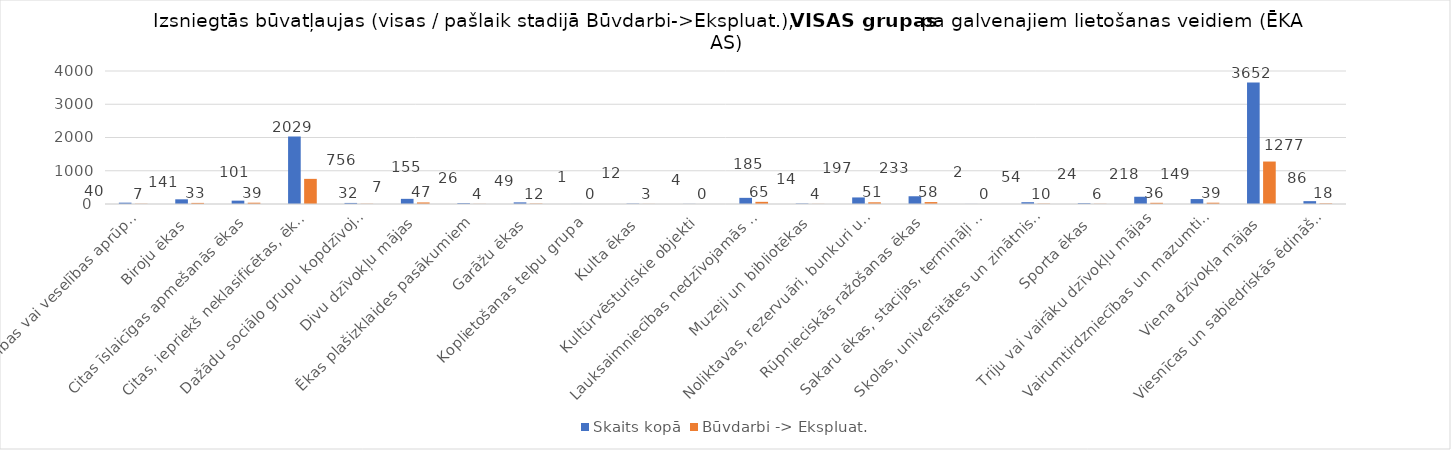
| Category | Skaits kopā | Būvdarbi -> Ekspluat. |
|---|---|---|
| Ārstniecības vai veselības aprūpes iestāžu ēkas | 40 | 7 |
| Biroju ēkas | 141 | 33 |
| Citas īslaicīgas apmešanās ēkas | 101 | 39 |
| Citas, iepriekš neklasificētas, ēkas | 2029 | 756 |
| Dažādu sociālo grupu kopdzīvojamās mājas | 32 | 7 |
| Divu dzīvokļu mājas | 155 | 47 |
| Ēkas plašizklaides pasākumiem | 26 | 4 |
| Garāžu ēkas | 49 | 12 |
| Koplietošanas telpu grupa | 1 | 0 |
| Kulta ēkas | 12 | 3 |
| Kultūrvēsturiskie objekti | 4 | 0 |
| Lauksaimniecības nedzīvojamās ēkas | 185 | 65 |
| Muzeji un bibliotēkas | 14 | 4 |
| Noliktavas, rezervuāri, bunkuri un silosi | 197 | 51 |
| Rūpnieciskās ražošanas ēkas | 233 | 58 |
| Sakaru ēkas, stacijas, termināļi un ar tiem saistītās ēkas | 2 | 0 |
| Skolas, universitātes un zinātniskajai pētniecībai paredzētās ēkas | 54 | 10 |
| Sporta ēkas | 24 | 6 |
| Triju vai vairāku dzīvokļu mājas | 218 | 36 |
| Vairumtirdzniecības un mazumtirdzniecības ēkas | 149 | 39 |
| Viena dzīvokļa mājas | 3652 | 1277 |
| Viesnīcas un sabiedriskās ēdināšanas ēkas | 86 | 18 |